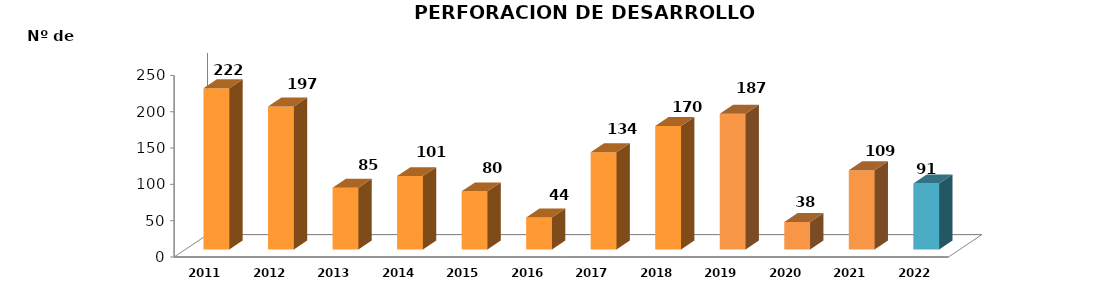
| Category | Series 0 |
|---|---|
| 2011.0 | 222 |
| 2012.0 | 197 |
| 2013.0 | 85 |
| 2014.0 | 101 |
| 2015.0 | 80 |
| 2016.0 | 44 |
| 2017.0 | 134 |
| 2018.0 | 170 |
| 2019.0 | 187 |
| 2020.0 | 38 |
| 2021.0 | 109 |
| 2022.0 | 91 |